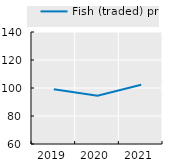
| Category | Fish (traded) price |
|---|---|
| 2019.0 | 99.051 |
| 2020.0 | 94.478 |
| 2021.0 | 102.256 |